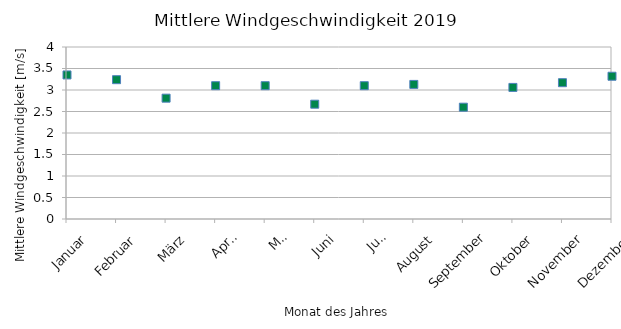
| Category | Series 0 |
|---|---|
| Januar | 3.35 |
| Februar | 3.24 |
| März | 2.81 |
| April | 3.1 |
| Mai | 3.1 |
| Juni | 2.67 |
| Juli | 3.1 |
| August | 3.13 |
| September | 2.6 |
| Oktober | 3.06 |
| November | 3.17 |
| Dezember | 3.32 |